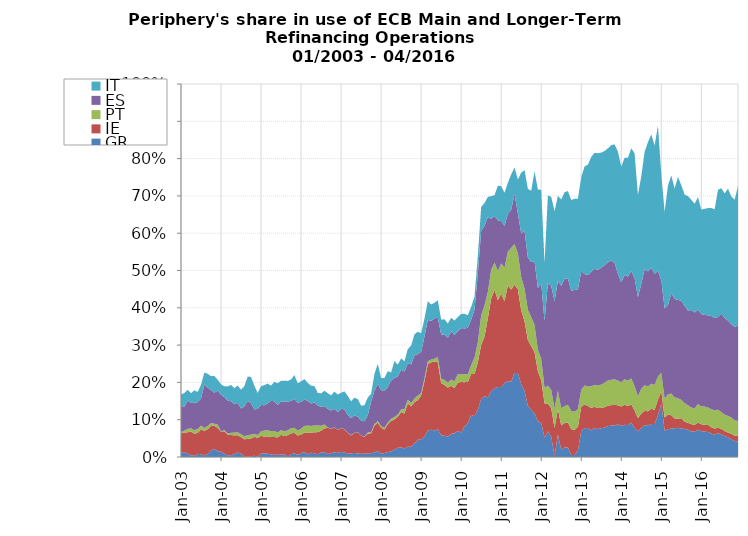
| Category | GR | IE | PT | ES | IT |
|---|---|---|---|---|---|
| 2003-01-01 | 0.014 | 0.05 | 0.003 | 0.07 | 0.031 |
| 2003-02-01 | 0.012 | 0.054 | 0.005 | 0.065 | 0.036 |
| 2003-03-01 | 0.01 | 0.057 | 0.009 | 0.075 | 0.03 |
| 2003-04-01 | 0.005 | 0.063 | 0.009 | 0.069 | 0.025 |
| 2003-05-01 | 0.003 | 0.06 | 0.009 | 0.073 | 0.034 |
| 2003-06-01 | 0.009 | 0.056 | 0.011 | 0.072 | 0.027 |
| 2003-07-01 | 0.007 | 0.067 | 0.01 | 0.073 | 0.037 |
| 2003-08-01 | 0.004 | 0.065 | 0.008 | 0.116 | 0.032 |
| 2003-09-01 | 0.008 | 0.067 | 0.009 | 0.103 | 0.037 |
| 2003-10-01 | 0.018 | 0.065 | 0.008 | 0.089 | 0.037 |
| 2003-11-01 | 0.022 | 0.063 | 0.005 | 0.083 | 0.045 |
| 2003-12-01 | 0.015 | 0.062 | 0.009 | 0.091 | 0.029 |
| 2004-01-01 | 0.014 | 0.054 | 0.001 | 0.098 | 0.028 |
| 2004-02-01 | 0.009 | 0.06 | 0.003 | 0.088 | 0.029 |
| 2004-03-01 | 0.004 | 0.056 | 0.003 | 0.088 | 0.038 |
| 2004-04-01 | 0.005 | 0.054 | 0.006 | 0.085 | 0.044 |
| 2004-05-01 | 0.008 | 0.05 | 0.008 | 0.076 | 0.043 |
| 2004-06-01 | 0.012 | 0.046 | 0.008 | 0.079 | 0.047 |
| 2004-07-01 | 0.009 | 0.044 | 0.008 | 0.069 | 0.05 |
| 2004-08-01 | 0.002 | 0.046 | 0.008 | 0.08 | 0.054 |
| 2004-09-01 | 0 | 0.048 | 0.01 | 0.092 | 0.065 |
| 2004-10-01 | 0.002 | 0.048 | 0.01 | 0.084 | 0.07 |
| 2004-11-01 | 0.003 | 0.051 | 0.008 | 0.065 | 0.064 |
| 2004-12-01 | 0.001 | 0.05 | 0.008 | 0.071 | 0.042 |
| 2005-01-01 | 0.009 | 0.048 | 0.012 | 0.071 | 0.05 |
| 2005-02-01 | 0.01 | 0.045 | 0.017 | 0.068 | 0.054 |
| 2005-03-01 | 0.009 | 0.046 | 0.016 | 0.073 | 0.053 |
| 2005-04-01 | 0.007 | 0.047 | 0.016 | 0.081 | 0.041 |
| 2005-05-01 | 0.006 | 0.048 | 0.016 | 0.08 | 0.052 |
| 2005-06-01 | 0.006 | 0.046 | 0.013 | 0.074 | 0.058 |
| 2005-07-01 | 0.006 | 0.053 | 0.013 | 0.077 | 0.055 |
| 2005-08-01 | 0.007 | 0.049 | 0.013 | 0.079 | 0.056 |
| 2005-09-01 | 0.001 | 0.058 | 0.013 | 0.077 | 0.056 |
| 2005-10-01 | 0.008 | 0.056 | 0.014 | 0.073 | 0.058 |
| 2005-11-01 | 0.01 | 0.055 | 0.014 | 0.078 | 0.064 |
| 2005-12-01 | 0.006 | 0.052 | 0.013 | 0.075 | 0.052 |
| 2006-01-01 | 0.01 | 0.05 | 0.016 | 0.071 | 0.055 |
| 2006-02-01 | 0.013 | 0.052 | 0.019 | 0.071 | 0.055 |
| 2006-03-01 | 0.007 | 0.059 | 0.018 | 0.066 | 0.048 |
| 2006-04-01 | 0.012 | 0.054 | 0.018 | 0.06 | 0.048 |
| 2006-05-01 | 0.01 | 0.056 | 0.018 | 0.062 | 0.044 |
| 2006-06-01 | 0.007 | 0.06 | 0.018 | 0.053 | 0.034 |
| 2006-07-01 | 0.012 | 0.058 | 0.013 | 0.05 | 0.036 |
| 2006-08-01 | 0.013 | 0.064 | 0.011 | 0.049 | 0.041 |
| 2006-09-01 | 0.008 | 0.071 | 0.001 | 0.05 | 0.042 |
| 2006-10-01 | 0.01 | 0.065 | 0 | 0.049 | 0.04 |
| 2006-11-01 | 0.013 | 0.067 | 0 | 0.049 | 0.046 |
| 2006-12-01 | 0.011 | 0.061 | 0 | 0.048 | 0.047 |
| 2007-01-01 | 0.014 | 0.064 | 0 | 0.051 | 0.043 |
| 2007-02-01 | 0.012 | 0.062 | 0 | 0.053 | 0.048 |
| 2007-03-01 | 0.008 | 0.056 | 0 | 0.048 | 0.051 |
| 2007-04-01 | 0.01 | 0.048 | 0.001 | 0.045 | 0.045 |
| 2007-05-01 | 0.011 | 0.053 | 0 | 0.047 | 0.048 |
| 2007-06-01 | 0.009 | 0.057 | 0.001 | 0.041 | 0.047 |
| 2007-07-01 | 0.009 | 0.048 | 0 | 0.041 | 0.04 |
| 2007-08-01 | 0.009 | 0.046 | 0.001 | 0.041 | 0.043 |
| 2007-09-01 | 0.01 | 0.052 | 0.003 | 0.046 | 0.048 |
| 2007-10-01 | 0.01 | 0.054 | 0.003 | 0.081 | 0.021 |
| 2007-11-01 | 0.012 | 0.072 | 0.004 | 0.09 | 0.045 |
| 2007-12-01 | 0.017 | 0.075 | 0.005 | 0.1 | 0.054 |
| 2008-01-01 | 0.009 | 0.069 | 0.004 | 0.096 | 0.032 |
| 2008-02-01 | 0.011 | 0.063 | 0.005 | 0.098 | 0.035 |
| 2008-03-01 | 0.014 | 0.075 | 0.004 | 0.096 | 0.042 |
| 2008-04-01 | 0.015 | 0.082 | 0.006 | 0.102 | 0.022 |
| 2008-05-01 | 0.021 | 0.08 | 0.007 | 0.105 | 0.045 |
| 2008-06-01 | 0.025 | 0.083 | 0.005 | 0.102 | 0.032 |
| 2008-07-01 | 0.026 | 0.095 | 0.007 | 0.106 | 0.03 |
| 2008-08-01 | 0.023 | 0.093 | 0.012 | 0.101 | 0.027 |
| 2008-09-01 | 0.028 | 0.115 | 0.011 | 0.097 | 0.038 |
| 2008-10-01 | 0.027 | 0.108 | 0.009 | 0.104 | 0.051 |
| 2008-11-01 | 0.036 | 0.111 | 0.01 | 0.115 | 0.056 |
| 2008-12-01 | 0.046 | 0.106 | 0.012 | 0.111 | 0.06 |
| 2009-01-01 | 0.047 | 0.117 | 0.007 | 0.11 | 0.05 |
| 2009-02-01 | 0.055 | 0.148 | 0.007 | 0.112 | 0.048 |
| 2009-03-01 | 0.071 | 0.178 | 0.008 | 0.111 | 0.05 |
| 2009-04-01 | 0.073 | 0.181 | 0.007 | 0.104 | 0.044 |
| 2009-05-01 | 0.071 | 0.185 | 0.008 | 0.108 | 0.042 |
| 2009-06-01 | 0.074 | 0.18 | 0.015 | 0.105 | 0.047 |
| 2009-07-01 | 0.058 | 0.14 | 0.012 | 0.119 | 0.04 |
| 2009-08-01 | 0.057 | 0.137 | 0.013 | 0.122 | 0.041 |
| 2009-09-01 | 0.054 | 0.132 | 0.013 | 0.121 | 0.038 |
| 2009-10-01 | 0.062 | 0.129 | 0.017 | 0.13 | 0.036 |
| 2009-11-01 | 0.064 | 0.121 | 0.018 | 0.125 | 0.038 |
| 2009-12-01 | 0.07 | 0.13 | 0.023 | 0.115 | 0.038 |
| 2010-01-01 | 0.066 | 0.135 | 0.021 | 0.124 | 0.038 |
| 2010-02-01 | 0.083 | 0.118 | 0.021 | 0.123 | 0.039 |
| 2010-03-01 | 0.09 | 0.111 | 0.021 | 0.124 | 0.034 |
| 2010-04-01 | 0.113 | 0.109 | 0.024 | 0.122 | 0.034 |
| 2010-05-01 | 0.109 | 0.113 | 0.043 | 0.129 | 0.035 |
| 2010-06-01 | 0.127 | 0.127 | 0.054 | 0.184 | 0.048 |
| 2010-07-01 | 0.156 | 0.145 | 0.079 | 0.227 | 0.064 |
| 2010-08-01 | 0.163 | 0.16 | 0.084 | 0.214 | 0.06 |
| 2010-09-01 | 0.16 | 0.212 | 0.071 | 0.201 | 0.054 |
| 2010-10-01 | 0.177 | 0.249 | 0.077 | 0.136 | 0.061 |
| 2010-11-01 | 0.184 | 0.264 | 0.074 | 0.125 | 0.056 |
| 2010-12-01 | 0.188 | 0.233 | 0.078 | 0.136 | 0.093 |
| 2011-01-01 | 0.187 | 0.25 | 0.081 | 0.113 | 0.094 |
| 2011-02-01 | 0.199 | 0.219 | 0.09 | 0.112 | 0.088 |
| 2011-03-01 | 0.203 | 0.257 | 0.09 | 0.101 | 0.083 |
| 2011-04-01 | 0.202 | 0.247 | 0.112 | 0.102 | 0.095 |
| 2011-05-01 | 0.225 | 0.236 | 0.109 | 0.134 | 0.071 |
| 2011-06-01 | 0.225 | 0.225 | 0.096 | 0.108 | 0.09 |
| 2011-07-01 | 0.195 | 0.198 | 0.09 | 0.116 | 0.163 |
| 2011-08-01 | 0.177 | 0.186 | 0.088 | 0.155 | 0.162 |
| 2011-09-01 | 0.137 | 0.177 | 0.081 | 0.14 | 0.185 |
| 2011-10-01 | 0.127 | 0.17 | 0.078 | 0.148 | 0.191 |
| 2011-11-01 | 0.117 | 0.164 | 0.073 | 0.17 | 0.242 |
| 2011-12-01 | 0.096 | 0.134 | 0.058 | 0.166 | 0.264 |
| 2012-01-01 | 0.091 | 0.115 | 0.058 | 0.201 | 0.252 |
| 2012-02-01 | 0.052 | 0.092 | 0.042 | 0.179 | 0.156 |
| 2012-03-01 | 0.068 | 0.074 | 0.049 | 0.275 | 0.235 |
| 2012-04-01 | 0.055 | 0.076 | 0.049 | 0.279 | 0.239 |
| 2012-05-01 | 0.003 | 0.075 | 0.052 | 0.288 | 0.242 |
| 2012-06-01 | 0.06 | 0.069 | 0.049 | 0.295 | 0.228 |
| 2012-07-31 | 0.02 | 0.065 | 0.046 | 0.328 | 0.231 |
| 2012-08-31 | 0.026 | 0.066 | 0.045 | 0.341 | 0.232 |
| 2012-09-30 | 0.026 | 0.067 | 0.047 | 0.339 | 0.234 |
| 2012-10-31 | 0.006 | 0.069 | 0.049 | 0.322 | 0.243 |
| 2012-11-30 | 0.005 | 0.068 | 0.049 | 0.326 | 0.244 |
| 2012-12-31 | 0.017 | 0.064 | 0.047 | 0.32 | 0.244 |
| 2013-01-31 | 0.07 | 0.064 | 0.046 | 0.318 | 0.252 |
| 2013-02-28 | 0.077 | 0.064 | 0.051 | 0.299 | 0.289 |
| 2013-03-31 | 0.078 | 0.059 | 0.053 | 0.299 | 0.296 |
| 2013-04-30 | 0.071 | 0.061 | 0.058 | 0.307 | 0.308 |
| 2013-05-31 | 0.078 | 0.056 | 0.058 | 0.311 | 0.311 |
| 2013-06-30 | 0.075 | 0.056 | 0.06 | 0.31 | 0.313 |
| 2013-07-31 | 0.077 | 0.054 | 0.062 | 0.314 | 0.308 |
| 2013-08-31 | 0.079 | 0.055 | 0.065 | 0.316 | 0.306 |
| 2013-09-30 | 0.083 | 0.055 | 0.067 | 0.317 | 0.305 |
| 2013-10-31 | 0.084 | 0.055 | 0.068 | 0.319 | 0.31 |
| 2013-11-30 | 0.085 | 0.055 | 0.068 | 0.312 | 0.318 |
| 2013-12-31 | 0.088 | 0.051 | 0.066 | 0.287 | 0.327 |
| 2014-01-31 | 0.084 | 0.051 | 0.065 | 0.268 | 0.31 |
| 2014-02-28 | 0.086 | 0.054 | 0.069 | 0.28 | 0.314 |
| 2014-03-31 | 0.086 | 0.051 | 0.068 | 0.279 | 0.319 |
| 2014-04-30 | 0.092 | 0.049 | 0.07 | 0.288 | 0.329 |
| 2014-05-31 | 0.078 | 0.046 | 0.065 | 0.29 | 0.334 |
| 2014-06-30 | 0.069 | 0.035 | 0.059 | 0.266 | 0.274 |
| 2014-07-31 | 0.078 | 0.039 | 0.066 | 0.281 | 0.289 |
| 2014-08-31 | 0.085 | 0.038 | 0.069 | 0.312 | 0.314 |
| 2014-09-30 | 0.085 | 0.038 | 0.066 | 0.308 | 0.346 |
| 2014-10-31 | 0.088 | 0.041 | 0.067 | 0.311 | 0.357 |
| 2014-11-30 | 0.088 | 0.038 | 0.067 | 0.297 | 0.344 |
| 2014-12-31 | 0.112 | 0.041 | 0.062 | 0.284 | 0.389 |
| 2015-01-31 | 0.143 | 0.033 | 0.049 | 0.248 | 0.285 |
| 2015-02-28 | 0.071 | 0.035 | 0.051 | 0.242 | 0.259 |
| 2015-03-31 | 0.074 | 0.039 | 0.054 | 0.239 | 0.32 |
| 2015-04-30 | 0.076 | 0.036 | 0.058 | 0.269 | 0.315 |
| 2015-05-31 | 0.077 | 0.026 | 0.057 | 0.264 | 0.297 |
| 2015-06-30 | 0.078 | 0.024 | 0.055 | 0.263 | 0.33 |
| 2015-07-31 | 0.076 | 0.028 | 0.049 | 0.266 | 0.31 |
| 2015-08-31 | 0.075 | 0.019 | 0.05 | 0.26 | 0.299 |
| 2015-09-30 | 0.073 | 0.019 | 0.047 | 0.254 | 0.307 |
| 2015-10-31 | 0.069 | 0.019 | 0.045 | 0.261 | 0.296 |
| 2015-11-30 | 0.068 | 0.018 | 0.044 | 0.257 | 0.292 |
| 2015-12-31 | 0.073 | 0.019 | 0.05 | 0.254 | 0.301 |
| 2016-01-31 | 0.069 | 0.019 | 0.048 | 0.247 | 0.28 |
| 2016-02-29 | 0.068 | 0.018 | 0.049 | 0.246 | 0.284 |
| 2016-03-31 | 0.067 | 0.019 | 0.047 | 0.247 | 0.288 |
| 2016-04-30 | 0.063 | 0.017 | 0.048 | 0.25 | 0.29 |
| 2016-05-31 | 0.06 | 0.016 | 0.049 | 0.247 | 0.292 |
| 2016-06-30 | 0.064 | 0.014 | 0.049 | 0.249 | 0.341 |
| 2016-07-31 | 0.06 | 0.015 | 0.045 | 0.264 | 0.336 |
| 2016-08-31 | 0.057 | 0.013 | 0.044 | 0.26 | 0.334 |
| 2016-09-30 | 0.053 | 0.013 | 0.045 | 0.256 | 0.354 |
| 2016-10-31 | 0.047 | 0.015 | 0.043 | 0.251 | 0.342 |
| 2016-11-30 | 0.043 | 0.015 | 0.041 | 0.25 | 0.341 |
| 2016-12-31 | 0.042 | 0.014 | 0.041 | 0.256 | 0.374 |